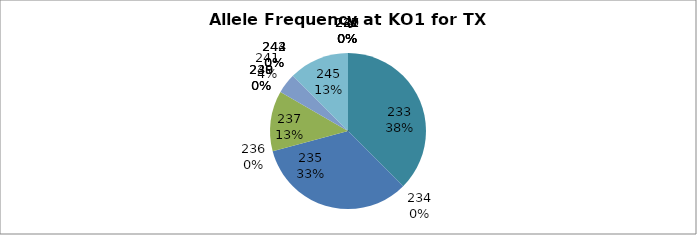
| Category | Series 0 |
|---|---|
| 221.0 | 0 |
| 227.0 | 0 |
| 231.0 | 0 |
| 232.0 | 0 |
| 233.0 | 0.375 |
| 234.0 | 0 |
| 235.0 | 0.333 |
| 236.0 | 0 |
| 237.0 | 0.125 |
| 238.0 | 0 |
| 239.0 | 0 |
| 240.0 | 0 |
| 241.0 | 0.042 |
| 242.0 | 0 |
| 243.0 | 0 |
| 244.0 | 0 |
| 245.0 | 0.125 |
| 247.0 | 0 |
| 249.0 | 0 |